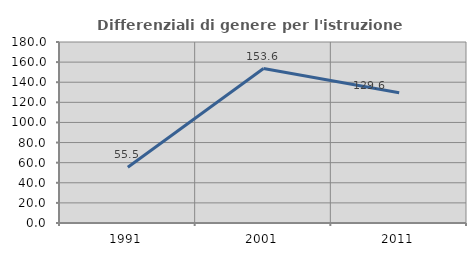
| Category | Differenziali di genere per l'istruzione superiore |
|---|---|
| 1991.0 | 55.469 |
| 2001.0 | 153.595 |
| 2011.0 | 129.63 |